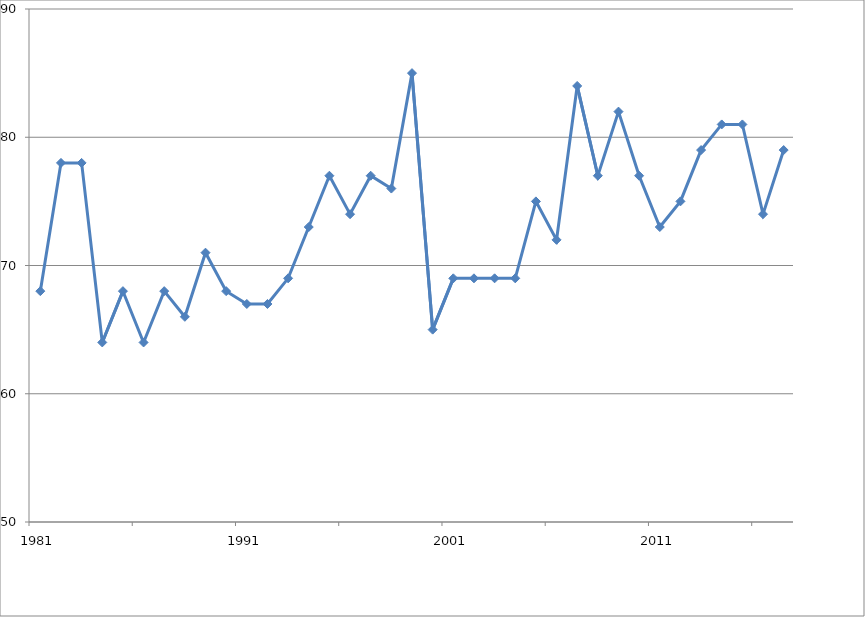
| Category | Series 0 |
|---|---|
| 1981.0 | 68 |
| 1982.0 | 78 |
| 1983.0 | 78 |
| 1984.0 | 64 |
| 1985.0 | 68 |
| 1986.0 | 64 |
| 1987.0 | 68 |
| 1988.0 | 66 |
| 1989.0 | 71 |
| 1990.0 | 68 |
| 1991.0 | 67 |
| 1992.0 | 67 |
| 1993.0 | 69 |
| 1994.0 | 73 |
| 1995.0 | 77 |
| 1996.0 | 74 |
| 1997.0 | 77 |
| 1998.0 | 76 |
| 1999.0 | 85 |
| 2000.0 | 65 |
| 2001.0 | 69 |
| 2002.0 | 69 |
| 2003.0 | 69 |
| 2004.0 | 69 |
| 2005.0 | 75 |
| 2006.0 | 72 |
| 2007.0 | 84 |
| 2008.0 | 77 |
| 2009.0 | 82 |
| 2010.0 | 77 |
| 2011.0 | 73 |
| 2012.0 | 75 |
| 2013.0 | 79 |
| 2014.0 | 81 |
| 2015.0 | 81 |
| 2016.0 | 74 |
| 2017.0 | 79 |